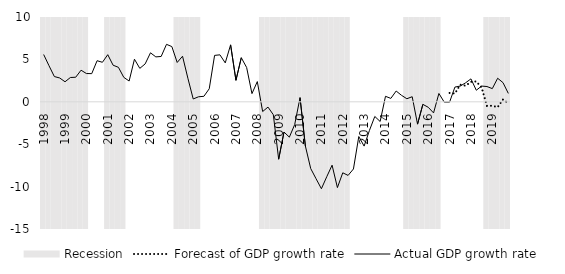
| Category | Recession |
|---|---|
| 1998.0 | 1 |
| 1998.0 | 1 |
| 1998.0 | 1 |
| 1998.0 | 1 |
| 1999.0 | 1 |
| 1999.0 | 1 |
| 1999.0 | 1 |
| 1999.0 | 1 |
| 2000.0 | 1 |
| 2000.0 | 0 |
| 2000.0 | 0 |
| 2000.0 | 0 |
| 2001.0 | 1 |
| 2001.0 | 1 |
| 2001.0 | 1 |
| 2001.0 | 1 |
| 2002.0 | 0 |
| 2002.0 | 0 |
| 2002.0 | 0 |
| 2002.0 | 0 |
| 2003.0 | 0 |
| 2003.0 | 0 |
| 2003.0 | 0 |
| 2003.0 | 0 |
| 2004.0 | 0 |
| 2004.0 | 1 |
| 2004.0 | 1 |
| 2004.0 | 1 |
| 2005.0 | 1 |
| 2005.0 | 1 |
| 2005.0 | 0 |
| 2005.0 | 0 |
| 2006.0 | 0 |
| 2006.0 | 0 |
| 2006.0 | 0 |
| 2006.0 | 0 |
| 2007.0 | 0 |
| 2007.0 | 0 |
| 2007.0 | 0 |
| 2007.0 | 0 |
| 2008.0 | 0 |
| 2008.0 | 1 |
| 2008.0 | 1 |
| 2008.0 | 1 |
| 2009.0 | 1 |
| 2009.0 | 1 |
| 2009.0 | 1 |
| 2009.0 | 1 |
| 2010.0 | 1 |
| 2010.0 | 1 |
| 2010.0 | 1 |
| 2010.0 | 1 |
| 2011.0 | 1 |
| 2011.0 | 1 |
| 2011.0 | 1 |
| 2011.0 | 1 |
| 2012.0 | 1 |
| 2012.0 | 1 |
| 2012.0 | 0 |
| 2012.0 | 0 |
| 2013.0 | 0 |
| 2013.0 | 0 |
| 2013.0 | 0 |
| 2013.0 | 0 |
| 2014.0 | 0 |
| 2014.0 | 0 |
| 2014.0 | 0 |
| 2014.0 | 0 |
| 2015.0 | 1 |
| 2015.0 | 1 |
| 2015.0 | 1 |
| 2015.0 | 1 |
| 2016.0 | 1 |
| 2016.0 | 1 |
| 2016.0 | 1 |
| 2016.0 | 0 |
| 2017.0 | 0 |
| 2017.0 | 0 |
| 2017.0 | 0 |
| 2017.0 | 0 |
| 2018.0 | 0 |
| 2018.0 | 0 |
| 2018.0 | 0 |
| 2018.0 | 1 |
| 2019.0 | 1 |
| 2019.0 | 1 |
| 2019.0 | 1 |
| 2019.0 | 1 |